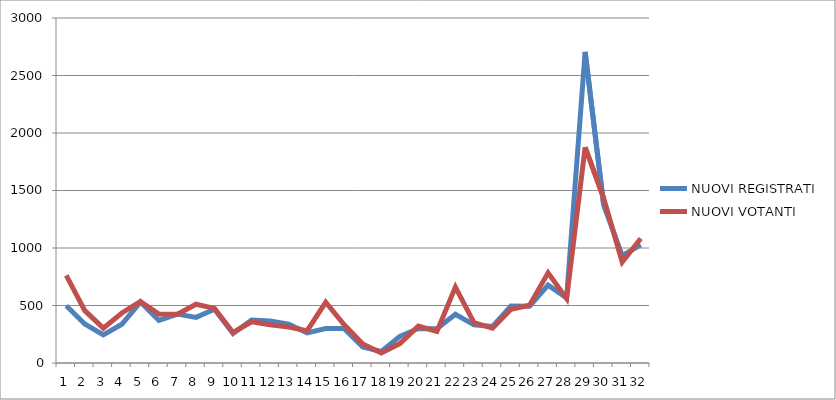
| Category | NUOVI REGISTRATI | NUOVI VOTANTI |
|---|---|---|
| 0 | 498 | 762 |
| 1 | 339 | 455 |
| 2 | 245 | 303 |
| 3 | 337 | 435 |
| 4 | 530 | 534 |
| 5 | 370 | 426 |
| 6 | 425 | 425 |
| 7 | 397 | 511 |
| 8 | 467 | 475 |
| 9 | 256 | 266 |
| 10 | 374 | 359 |
| 11 | 366 | 333 |
| 12 | 337 | 312 |
| 13 | 262 | 281 |
| 14 | 299 | 528 |
| 15 | 299 | 332 |
| 16 | 140 | 166 |
| 17 | 100 | 87 |
| 18 | 232 | 169 |
| 19 | 301 | 321 |
| 20 | 298 | 274 |
| 21 | 424 | 660 |
| 22 | 332 | 351 |
| 23 | 318 | 302 |
| 24 | 495 | 467 |
| 25 | 493 | 502 |
| 26 | 677 | 784 |
| 27 | 565 | 560 |
| 28 | 2705 | 1876 |
| 29 | 1372 | 1433 |
| 30 | 934 | 878 |
| 31 | 1027 | 1082 |